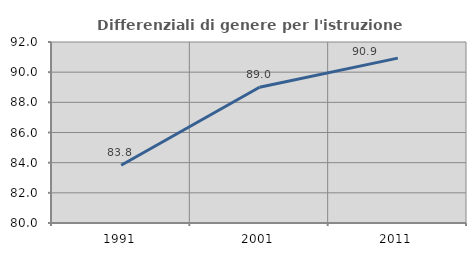
| Category | Differenziali di genere per l'istruzione superiore |
|---|---|
| 1991.0 | 83.825 |
| 2001.0 | 89.002 |
| 2011.0 | 90.929 |